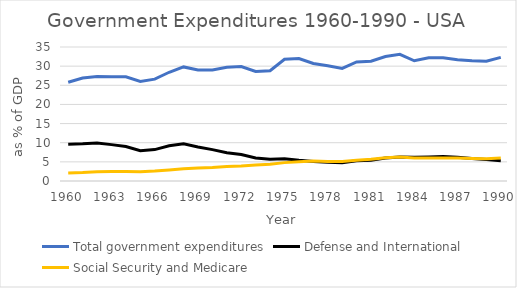
| Category | Total government expenditures | Defense and International | Social Security and Medicare |
|---|---|---|---|
| 1960 | 25.8 | 9.6 | 2.1 |
| 1961 | 26.9 | 9.7 | 2.2 |
| 1962 | 27.3 | 9.9 | 2.4 |
| 1963 | 27.2 | 9.5 | 2.5 |
| 1964 | 27.2 | 9 | 2.5 |
| 1965 | 26 | 7.9 | 2.4 |
| 1966 | 26.6 | 8.2 | 2.6 |
| 1967 | 28.4 | 9.2 | 2.9 |
| 1968 | 29.8 | 9.7 | 3.2 |
| 1969 | 29 | 8.9 | 3.4 |
| 1970 | 29 | 8.2 | 3.5 |
| 1971 | 29.7 | 7.4 | 3.8 |
| 1972 | 29.9 | 6.9 | 3.9 |
| 1973 | 28.6 | 6 | 4.2 |
| 1974 | 28.8 | 5.7 | 4.4 |
| 1975 | 31.8 | 5.8 | 4.8 |
| 1976 | 32 | 5.4 | 5 |
| 1977 | 30.7 | 5.1 | 5.2 |
| 1978 | 30.1 | 4.9 | 5.1 |
| 1979 | 29.4 | 4.8 | 5.1 |
| 1980 | 31.1 | 5.3 | 5.4 |
| 1981 | 31.3 | 5.4 | 5.7 |
| 1982 | 32.5 | 6 | 6.1 |
| 1983 | 33.1 | 6.3 | 6.3 |
| 1984 | 31.4 | 6.2 | 6 |
| 1985 | 32.2 | 6.3 | 6 |
| 1986 | 32.2 | 6.4 | 6 |
| 1987 | 31.7 | 6.2 | 6 |
| 1988 | 31.4 | 5.9 | 5.9 |
| 1989 | 31.3 | 5.6 | 5.8 |
| 1990 | 32.3 | 5.3 | 6 |